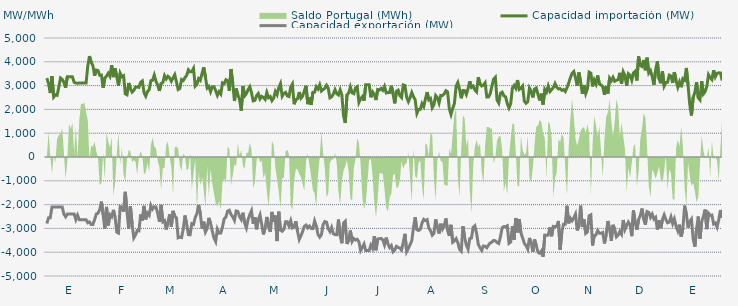
| Category | Capacidad importación (MW) | Capacidad exportación (MW) |
|---|---|---|
| 0 | 3316.667 | -2795.833 |
| 1900-01-01 | 3082.167 | -2550 |
| 1900-01-02 | 2687.5 | -2550 |
| 1900-01-03 | 3400 | -2100 |
| 1900-01-04 | 2520.833 | -2100 |
| 1900-01-05 | 2614.583 | -2100 |
| 1900-01-06 | 2591.25 | -2100 |
| 1900-01-07 | 2932.083 | -2100 |
| 1900-01-08 | 3318.75 | -2100 |
| 1900-01-09 | 3262.5 | -2100 |
| 1900-01-10 | 3139.583 | -2400 |
| 1900-01-11 | 2912.5 | -2512.5 |
| 1900-01-12 | 3366.667 | -2400 |
| 1900-01-13 | 3366.667 | -2400 |
| 1900-01-14 | 3366.667 | -2400 |
| 1900-01-15 | 3366.667 | -2400 |
| 1900-01-16 | 3139.583 | -2400 |
| 1900-01-17 | 3108.333 | -2633.333 |
| 1900-01-18 | 3100 | -2445.833 |
| 1900-01-19 | 3108.333 | -2633.333 |
| 1900-01-20 | 3108.333 | -2633.333 |
| 1900-01-21 | 3108.333 | -2633.333 |
| 1900-01-22 | 3108.333 | -2633.333 |
| 1900-01-23 | 3108.333 | -2633.333 |
| 1900-01-24 | 3822.917 | -2766.667 |
| 1900-01-25 | 4239.583 | -2729.167 |
| 1900-01-26 | 3979.167 | -2833.333 |
| 1900-01-27 | 3841.667 | -2833.333 |
| 1900-01-28 | 3414.375 | -2634.375 |
| 1900-01-29 | 3652.5 | -2392.5 |
| 1900-01-30 | 3633.75 | -2364.375 |
| 1900-01-31 | 3431.25 | -2212.5 |
| 1900-02-01 | 3442.5 | -1876.875 |
| 1900-02-02 | 2908.125 | -2420.625 |
| 1900-02-03 | 3318.75 | -3009.375 |
| 1900-02-04 | 3401.25 | -2096.25 |
| 1900-02-05 | 3519.375 | -2876.25 |
| 1900-02-06 | 3392.5 | -2430 |
| 1900-02-07 | 3856.875 | -2512.5 |
| 1900-02-08 | 3356.25 | -2221.875 |
| 1900-02-09 | 3727.5 | -2516.25 |
| 1900-02-10 | 3372.5 | -3157.5 |
| 1900-02-11 | 3000.208 | -3195 |
| 1900-02-12 | 3522.083 | -2079.375 |
| 1900-02-13 | 3371.667 | -2122.5 |
| 1900-02-14 | 3412.5 | -2291.25 |
| 1900-02-15 | 2653.125 | -1464.375 |
| 1900-02-16 | 2615 | -2298.75 |
| 1900-02-17 | 3110.625 | -3018.75 |
| 1900-02-18 | 2861.792 | -2062.5 |
| 1900-02-19 | 2726.042 | -2823.75 |
| 1900-02-20 | 2799.583 | -3397.5 |
| 1900-02-21 | 2936.25 | -3273.75 |
| 1900-02-22 | 2938.125 | -3091.875 |
| 1900-02-23 | 2925 | -3101.25 |
| 1900-02-24 | 3136.875 | -2413.125 |
| 1900-02-25 | 3195.208 | -2666.25 |
| 1900-02-26 | 2702.083 | -2053.125 |
| 1900-02-27 | 2556.042 | -2621.25 |
| 1900-02-28 | 2748.75 | -2355 |
| 1900-02-28 | 2825.625 | -2448.75 |
| 1900-03-01 | 3204.375 | -2034.375 |
| 1900-03-02 | 3223.333 | -2188.125 |
| 1900-03-03 | 3440.625 | -2092.5 |
| 1900-03-04 | 3180 | -2100 |
| 1900-03-05 | 3016.875 | -2368.125 |
| 1900-03-06 | 2777.292 | -2722.5 |
| 1900-03-07 | 3084.375 | -2008.125 |
| 1900-03-08 | 3130.833 | -2720.625 |
| 1900-03-09 | 3418.75 | -2671.875 |
| 1900-03-10 | 3277.917 | -3046.875 |
| 1900-03-11 | 3390.833 | -2735.625 |
| 1900-03-12 | 3326.25 | -2407.5 |
| 1900-03-13 | 3180 | -2921.25 |
| 1900-03-14 | 3320.625 | -2262.708 |
| 1900-03-15 | 3457.5 | -2488.125 |
| 1900-03-16 | 3158.75 | -2557.5 |
| 1900-03-17 | 2836.25 | -3393.75 |
| 1900-03-18 | 2879.167 | -3365.625 |
| 1900-03-19 | 3254.167 | -3384.375 |
| 1900-03-20 | 3214.167 | -3018.75 |
| 1900-03-21 | 3335.625 | -2460 |
| 1900-03-22 | 3429.375 | -2818.125 |
| 1900-03-23 | 3663.75 | -3258.75 |
| 1900-03-24 | 3577.583 | -3268.125 |
| 1900-03-25 | 3586.875 | -2801.25 |
| 1900-03-26 | 3721.875 | -2831.25 |
| 1900-03-27 | 2977.5 | -2542.5 |
| 1900-03-28 | 3058.043 | -2379.13 |
| 1900-03-29 | 3294.375 | -2013.75 |
| 1900-03-30 | 3223.125 | -2388.75 |
| 1900-03-31 | 3506.25 | -3005.625 |
| 1900-04-01 | 3770.625 | -2718.75 |
| 1900-04-02 | 3346.875 | -3153.75 |
| 1900-04-03 | 2898.75 | -3009.375 |
| 1900-04-04 | 2966.25 | -2556.708 |
| 1900-04-05 | 2745.417 | -2786.25 |
| 1900-04-06 | 2951.25 | -3112.083 |
| 1900-04-07 | 2955 | -3401.25 |
| 1900-04-08 | 2788.125 | -3553.125 |
| 1900-04-09 | 2587.5 | -3033.75 |
| 1900-04-10 | 2745 | -3200.625 |
| 1900-04-11 | 2645.625 | -3195 |
| 1900-04-12 | 3116.25 | -2932.5 |
| 1900-04-13 | 3084.375 | -2598.75 |
| 1900-04-14 | 3247.5 | -2520 |
| 1900-04-15 | 3208.125 | -2272.5 |
| 1900-04-16 | 2782.708 | -2238.75 |
| 1900-04-17 | 3697.5 | -2418.75 |
| 1900-04-18 | 3103.125 | -2514.375 |
| 1900-04-19 | 2351.667 | -2662.5 |
| 1900-04-20 | 2876.25 | -2268.75 |
| 1900-04-21 | 2613.75 | -2287.5 |
| 1900-04-22 | 2422.5 | -2499.375 |
| 1900-04-23 | 1945.5 | -2625 |
| 1900-04-24 | 2981.25 | -2341.875 |
| 1900-04-25 | 2567.917 | -2775 |
| 1900-04-26 | 2658.542 | -2977.5 |
| 1900-04-27 | 2829.375 | -2626.875 |
| 1900-04-28 | 2951.25 | -2420.625 |
| 1900-04-29 | 2701.875 | -2257.5 |
| 1900-04-30 | 2356.875 | -2804.792 |
| 1900-05-01 | 2381.875 | -2527.5 |
| 1900-05-02 | 2578.125 | -3035.625 |
| 1900-05-03 | 2666.25 | -2621.042 |
| 1900-05-04 | 2439.583 | -2431.875 |
| 1900-05-05 | 2546.667 | -2835 |
| 1900-05-06 | 2503.125 | -3253.125 |
| 1900-05-07 | 2418.75 | -2985 |
| 1900-05-08 | 2711.25 | -2516.25 |
| 1900-05-09 | 2490 | -2932.5 |
| 1900-05-10 | 2538.75 | -3144.375 |
| 1900-05-11 | 2367.708 | -2306.25 |
| 1900-05-12 | 2476.875 | -2730 |
| 1900-05-13 | 2754.375 | -2460 |
| 1900-05-14 | 2620.833 | -3533.333 |
| 1900-05-15 | 2916.875 | -2297.5 |
| 1900-05-16 | 3082.5 | -3063.75 |
| 1900-05-17 | 2553.75 | -3120 |
| 1900-05-18 | 2671.875 | -3043.125 |
| 1900-05-19 | 2716.875 | -2722.5 |
| 1900-05-20 | 2568.75 | -2724.375 |
| 1900-05-21 | 2540.625 | -2896.875 |
| 1900-05-22 | 2938.125 | -2677.5 |
| 1900-05-23 | 3066.667 | -2979.167 |
| 1900-05-24 | 2218.125 | -2926.875 |
| 1900-05-25 | 2411.25 | -2701.875 |
| 1900-05-26 | 2443.125 | -3125.625 |
| 1900-05-27 | 2729.167 | -3466.667 |
| 1900-05-28 | 2471.25 | -3315 |
| 1900-05-29 | 2561.875 | -3127.375 |
| 1900-05-30 | 2778.75 | -2917.5 |
| 1900-05-31 | 2992.5 | -2861.25 |
| 1900-06-01 | 2221.875 | -2981.25 |
| 1900-06-02 | 2505 | -2900.625 |
| 1900-06-03 | 2187.5 | -3000 |
| 1900-06-04 | 2711.75 | -3007.5 |
| 1900-06-05 | 2723.125 | -2684.417 |
| 1900-06-06 | 2956.125 | -2899.25 |
| 1900-06-07 | 2855.625 | -3256.875 |
| 1900-06-08 | 3033.333 | -3366.667 |
| 1900-06-09 | 2771.25 | -3262.5 |
| 1900-06-10 | 2832.375 | -2842.5 |
| 1900-06-11 | 2887.5 | -2711.042 |
| 1900-06-12 | 3015 | -2735.625 |
| 1900-06-13 | 2893.125 | -3015 |
| 1900-06-14 | 2486.25 | -3135 |
| 1900-06-15 | 2529.375 | -2958.75 |
| 1900-06-16 | 2643.75 | -3226.875 |
| 1900-06-17 | 2831.667 | -3261.75 |
| 1900-06-18 | 2662.25 | -3262.25 |
| 1900-06-19 | 2606.25 | -2627.792 |
| 1900-06-20 | 2823.75 | -3316.875 |
| 1900-06-21 | 2608.125 | -3622.5 |
| 1900-06-22 | 1721.458 | -2778.75 |
| 1900-06-23 | 1429.792 | -2700 |
| 1900-06-24 | 2611.875 | -3654.375 |
| 1900-06-25 | 2683.125 | -3478.125 |
| 1900-06-26 | 2941.875 | -3088.125 |
| 1900-06-27 | 2701.042 | -3549.167 |
| 1900-06-28 | 2664.375 | -3423.75 |
| 1900-06-29 | 2900.625 | -3487.5 |
| 1900-06-30 | 2951.25 | -3455.625 |
| 1900-07-01 | 2295 | -3562.5 |
| 1900-07-02 | 2445 | -3930 |
| 1900-07-03 | 2535 | -3798.75 |
| 1900-07-04 | 2364.375 | -3654.375 |
| 1900-07-05 | 3033.333 | -3933.333 |
| 1900-07-06 | 3033.333 | -3933.333 |
| 1900-07-07 | 3033.333 | -3933.333 |
| 1900-07-08 | 2508.75 | -3703.125 |
| 1900-07-09 | 2735.625 | -3838.125 |
| 1900-07-10 | 2628.75 | -3326.25 |
| 1900-07-11 | 2392.5 | -3918.75 |
| 1900-07-12 | 2835 | -3440.625 |
| 1900-07-13 | 2812.5 | -3438.75 |
| 1900-07-14 | 2880 | -3420 |
| 1900-07-15 | 2803.125 | -3481.875 |
| 1900-07-16 | 2964.375 | -3691.875 |
| 1900-07-17 | 2690.625 | -3386.25 |
| 1900-07-18 | 2715 | -3656.25 |
| 1900-07-19 | 2711.25 | -3804.375 |
| 1900-07-20 | 2998.125 | -3720 |
| 1900-07-21 | 2660.625 | -3978.75 |
| 1900-07-22 | 2253.75 | -3907.5 |
| 1900-07-23 | 2760 | -3751.875 |
| 1900-07-24 | 2808.75 | -3796.875 |
| 1900-07-25 | 2580 | -3828.75 |
| 1900-07-26 | 2499.375 | -3907.5 |
| 1900-07-27 | 3028.125 | -3577.5 |
| 1900-07-28 | 3001.875 | -3226.875 |
| 1900-07-29 | 2511.25 | -3976.875 |
| 1900-07-30 | 2326.875 | -3840 |
| 1900-07-31 | 2491.875 | -3684.375 |
| 1900-08-01 | 2710.208 | -3515.417 |
| 1900-08-02 | 2535 | -2956.875 |
| 1900-08-03 | 2401.875 | -2535 |
| 1900-08-04 | 1831.875 | -3056.25 |
| 1900-08-05 | 1995 | -3086.25 |
| 1900-08-06 | 2006.875 | -3037.5 |
| 1900-08-07 | 2244.375 | -2777.5 |
| 1900-08-08 | 2118.75 | -2619.375 |
| 1900-08-09 | 2437.5 | -2673.75 |
| 1900-08-10 | 2728.125 | -2634.375 |
| 1900-08-11 | 2403.75 | -2986.875 |
| 1900-08-12 | 2454.375 | -3099.375 |
| 1900-08-13 | 2071.875 | -3285 |
| 1900-08-14 | 2201.125 | -3208.125 |
| 1900-08-15 | 2582.958 | -2621.458 |
| 1900-08-16 | 2493.625 | -2943.125 |
| 1900-08-17 | 2270.5 | -3218.75 |
| 1900-08-18 | 2587.5 | -2803.125 |
| 1900-08-19 | 2581.875 | -3030 |
| 1900-08-20 | 2651.25 | -2895 |
| 1900-08-21 | 2784.375 | -2583.75 |
| 1900-08-22 | 2733.75 | -3084.375 |
| 1900-08-23 | 2030.625 | -3314.375 |
| 1900-08-24 | 1787.25 | -2849.375 |
| 1900-08-25 | 2040.625 | -3583.667 |
| 1900-08-26 | 2251.875 | -3525 |
| 1900-08-27 | 2977.5 | -3429.375 |
| 1900-08-28 | 3129.375 | -3594.583 |
| 1900-08-29 | 2844.375 | -3877.5 |
| 1900-08-30 | 2467.5 | -3956.25 |
| 1900-08-31 | 2793.75 | -2904.375 |
| 1900-09-01 | 2786.25 | -3382.5 |
| 1900-09-02 | 2626.875 | -3703.125 |
| 1900-09-03 | 2870.625 | -3871.875 |
| 1900-09-04 | 3183.75 | -3431.25 |
| 1900-09-05 | 2926.875 | -3403.125 |
| 1900-09-06 | 2979.375 | -2951.25 |
| 1900-09-07 | 2814.375 | -2887.5 |
| 1900-09-08 | 2737.5 | -3208.125 |
| 1900-09-09 | 3352.5 | -3671.25 |
| 1900-09-10 | 3078.75 | -3808.125 |
| 1900-09-11 | 2983.125 | -3926.25 |
| 1900-09-12 | 3018.75 | -3738.75 |
| 1900-09-13 | 3114.375 | -3751.875 |
| 1900-09-14 | 2520 | -3813.75 |
| 1900-09-15 | 2523.75 | -3697.292 |
| 1900-09-16 | 2658.542 | -3615 |
| 1900-09-17 | 2986.875 | -3575.625 |
| 1900-09-18 | 3273.625 | -3505.833 |
| 1900-09-19 | 3348.75 | -3519.375 |
| 1900-09-20 | 2390.625 | -3592.5 |
| 1900-09-21 | 2265 | -3631.875 |
| 1900-09-22 | 2675.625 | -3346.875 |
| 1900-09-23 | 2724.375 | -2973.75 |
| 1900-09-24 | 2571.875 | -2923.125 |
| 1900-09-25 | 2527.5 | -2930.042 |
| 1900-09-26 | 2244.375 | -2888.708 |
| 1900-09-27 | 2059.333 | -3626.25 |
| 1900-09-28 | 2244.375 | -3570 |
| 1900-09-29 | 2900 | -2900 |
| 1900-09-30 | 3007.5 | -3476.25 |
| 1900-10-01 | 2885.625 | -2562.917 |
| 1900-10-02 | 3233.333 | -3166.667 |
| 1900-10-03 | 2836.875 | -2610.208 |
| 1900-10-04 | 2889.375 | -3189.375 |
| 1900-10-05 | 2979.375 | -3399.375 |
| 1900-10-06 | 2345.625 | -3628.125 |
| 1900-10-07 | 2257.5 | -3725.625 |
| 1900-10-08 | 2323.125 | -3871.875 |
| 1900-10-09 | 2895 | -3401.25 |
| 1900-10-10 | 2760 | -3600 |
| 1900-10-11 | 2503.125 | -3987.75 |
| 1900-10-12 | 2855.625 | -3466.875 |
| 1900-10-13 | 2898.75 | -3720 |
| 1900-10-14 | 2628.75 | -3997.5 |
| 1900-10-15 | 2375.625 | -4044.375 |
| 1900-10-16 | 2660.625 | -3947.875 |
| 1900-10-17 | 2205 | -4190.625 |
| 1900-10-18 | 2840.625 | -3281.25 |
| 1900-10-19 | 2726.25 | -3292.5 |
| 1900-10-20 | 2983.125 | -3279.375 |
| 1900-10-21 | 2750.625 | -2960.625 |
| 1900-10-22 | 2827.5 | -3330 |
| 1900-10-23 | 2917.5 | -2915.625 |
| 1900-10-24 | 3087 | -2927.6 |
| 1900-10-25 | 2928.75 | -2903.792 |
| 1900-10-26 | 2857.5 | -2686.875 |
| 1900-10-27 | 2874.375 | -3894.375 |
| 1900-10-28 | 2803.125 | -3136.875 |
| 1900-10-29 | 2836.875 | -2825.625 |
| 1900-10-30 | 2752.5 | -2825.625 |
| 1900-10-31 | 2906.25 | -2049.375 |
| 1900-11-01 | 3106.875 | -2788.125 |
| 1900-11-02 | 3331.875 | -2572.5 |
| 1900-11-03 | 3513.75 | -2677.5 |
| 1900-11-04 | 3590.625 | -2555.625 |
| 1900-11-05 | 3328.125 | -2400 |
| 1900-11-06 | 2992.5 | -3084.375 |
| 1900-11-07 | 3551.25 | -2874.375 |
| 1900-11-08 | 3150 | -2045.625 |
| 1900-11-09 | 2658.75 | -2932.5 |
| 1900-11-10 | 3023.625 | -2619.5 |
| 1900-11-11 | 2664.375 | -3210 |
| 1900-11-12 | 2872.5 | -3142.5 |
| 1900-11-13 | 3564.375 | -2467.5 |
| 1900-11-14 | 3525 | -2430 |
| 1900-11-15 | 2966.25 | -3718.125 |
| 1900-11-16 | 3236.25 | -3300 |
| 1900-11-17 | 3069.375 | -3275.625 |
| 1900-11-18 | 3425.625 | -3086.25 |
| 1900-11-19 | 3071.25 | -3204.375 |
| 1900-11-20 | 3031.875 | -3206.25 |
| 1900-11-21 | 2947.5 | -3172.5 |
| 1900-11-22 | 2613.75 | -3633.75 |
| 1900-11-23 | 2977.5 | -3258.75 |
| 1900-11-24 | 2670 | -2689.583 |
| 1900-11-25 | 3315 | -3045 |
| 1900-11-26 | 3206.25 | -3523.125 |
| 1900-11-27 | 3348.75 | -2850 |
| 1900-11-28 | 3181.875 | -3038.125 |
| 1900-11-29 | 3225 | -3354.375 |
| 1900-11-30 | 3249.375 | -3283.125 |
| 1900-12-01 | 3536.25 | -3127.5 |
| 1900-12-02 | 3078.75 | -3241.875 |
| 1900-12-03 | 3578.333 | -2647.5 |
| 1900-12-04 | 3425.625 | -3048.75 |
| 1900-12-05 | 2990 | -2885.625 |
| 1900-12-06 | 3498.75 | -2733.75 |
| 1900-12-07 | 3433.125 | -2840.625 |
| 1900-12-08 | 3225 | -3326.25 |
| 1900-12-09 | 3534.375 | -2242.5 |
| 1900-12-10 | 3600 | -2760 |
| 1900-12-11 | 3215.625 | -3054.375 |
| 1900-12-12 | 4224.75 | -2629.167 |
| 1900-12-13 | 3843.75 | -2460 |
| 1900-12-14 | 3802.5 | -2167.5 |
| 1900-12-15 | 4076.25 | -2617.5 |
| 1900-12-16 | 3645 | -2842.5 |
| 1900-12-17 | 4173.75 | -2293.125 |
| 1900-12-18 | 3528.75 | -2328.75 |
| 1900-12-19 | 3628.125 | -2536.875 |
| 1900-12-20 | 3371.25 | -2401.875 |
| 1900-12-21 | 3033.75 | -2606.25 |
| 1900-12-22 | 3658.125 | -2535 |
| 1900-12-23 | 4021.875 | -3046.875 |
| 1900-12-24 | 3286.875 | -2666.25 |
| 1900-12-25 | 3097.5 | -2992.5 |
| 1900-12-26 | 3598.125 | -2625 |
| 1900-12-27 | 2981.25 | -2431.875 |
| 1900-12-28 | 3131.042 | -2628.75 |
| 1900-12-29 | 3142.5 | -2765.625 |
| 1900-12-30 | 3436.875 | -2737.5 |
| 1900-12-31 | 3403.125 | -2520 |
| 1901-01-01 | 3114.375 | -2795.625 |
| 1901-01-02 | 3568.125 | -2604.375 |
| 1901-01-03 | 3206.25 | -2913.75 |
| 1901-01-04 | 2931.042 | -3104.125 |
| 1901-01-05 | 3150 | -2842.75 |
| 1901-01-06 | 2933.875 | -3349.75 |
| 1901-01-07 | 3287.292 | -2997.25 |
| 1901-01-08 | 3230.625 | -2043.75 |
| 1901-01-09 | 3740.417 | -2390.833 |
| 1901-01-10 | 3032.708 | -2969.125 |
| 1901-01-11 | 2212.5 | -2711.25 |
| 1901-01-12 | 1744.583 | -2608.958 |
| 1901-01-13 | 2509.583 | -3447.25 |
| 1901-01-14 | 2711.25 | -3765 |
| 1901-01-15 | 3146.25 | -3022.5 |
| 1901-01-16 | 2484.375 | -2501.875 |
| 1901-01-17 | 2400 | -3436.875 |
| 1901-01-18 | 3185.625 | -2718.75 |
| 1901-01-19 | 2647.5 | -2503.125 |
| 1901-01-20 | 2745 | -2206.875 |
| 1901-01-21 | 2960.625 | -3030 |
| 1901-01-22 | 3457.5 | -2362.5 |
| 1901-01-23 | 3331.875 | -2454.375 |
| 1901-01-24 | 3251.25 | -2439.375 |
| 1901-01-25 | 3643.125 | -2812.5 |
| 1901-01-26 | 3367.5 | -2769.375 |
| 1901-01-27 | 3511.875 | -2945.625 |
| 1901-01-28 | 3538.125 | -2640 |
| 1901-01-29 | 3528.75 | -2227.5 |
| 1901-01-30 | 3215.625 | -2556.917 |